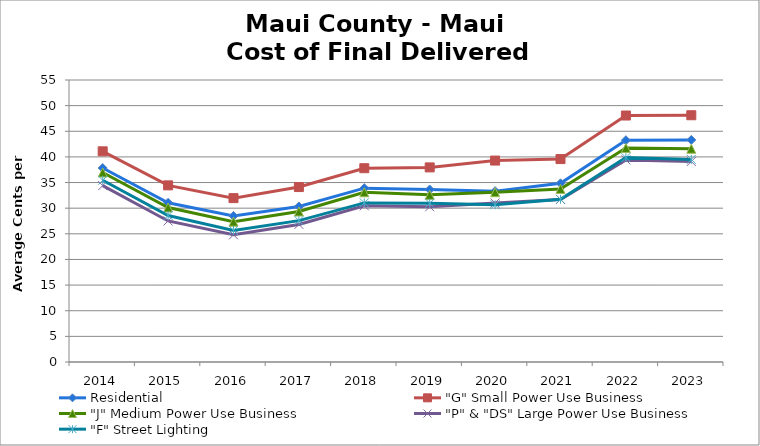
| Category | Residential | "G" Small Power Use Business | "J" Medium Power Use Business | "P" & "DS" Large Power Use Business | "F" Street Lighting |
|---|---|---|---|---|---|
| 2014.0 | 37.83 | 41.09 | 36.96 | 34.4 | 35.45 |
| 2015.0 | 31.05 | 34.45 | 30.13 | 27.51 | 28.57 |
| 2016.0 | 28.49 | 31.96 | 27.37 | 24.81 | 25.66 |
| 2017.0 | 30.34 | 34.12 | 29.35 | 26.83 | 27.57 |
| 2018.0 | 33.907 | 37.797 | 33.095 | 30.47 | 31.034 |
| 2019.0 | 33.646 | 37.955 | 32.598 | 30.279 | 30.967 |
| 2020.0 | 33.318 | 39.286 | 33.116 | 31.013 | 30.668 |
| 2021.0 | 34.849 | 39.575 | 33.759 | 31.695 | 31.73 |
| 2022.0 | 43.256 | 48.071 | 41.743 | 39.41 | 39.864 |
| 2023.0 | 43.31 | 48.127 | 41.593 | 39.113 | 39.517 |